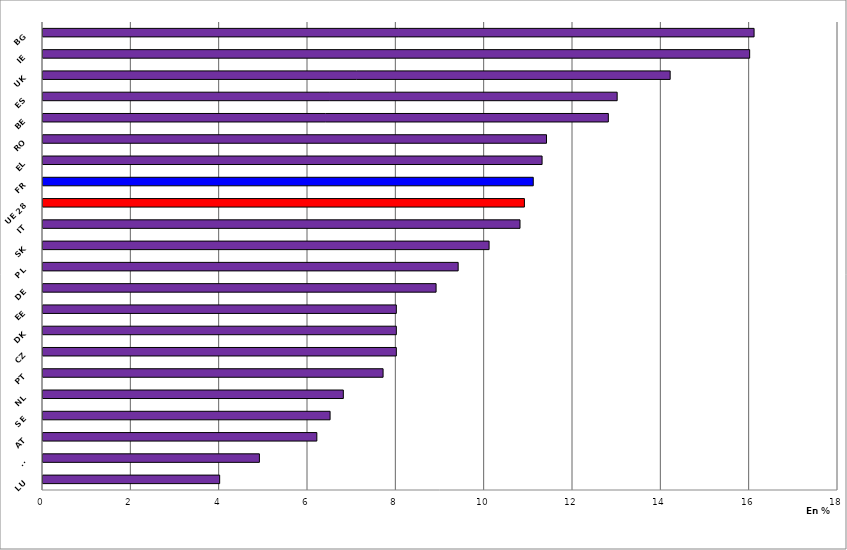
| Category | Part des 0-17 vivant dans des ménages dont aucun membre n'a d'emploi |
|---|---|
| LU | 4 |
| FI | 4.9 |
| AT | 6.2 |
| SE | 6.5 |
| NL | 6.8 |
| PT | 7.7 |
| CZ | 8 |
| DK | 8 |
| EE | 8 |
| DE | 8.9 |
| PL | 9.4 |
| SK | 10.1 |
| IT | 10.8 |
| UE 28 | 10.9 |
| FR | 11.1 |
| EL | 11.3 |
| RO | 11.4 |
| BE | 12.8 |
| ES | 13 |
| UK | 14.2 |
| IE | 16 |
| BG | 16.1 |